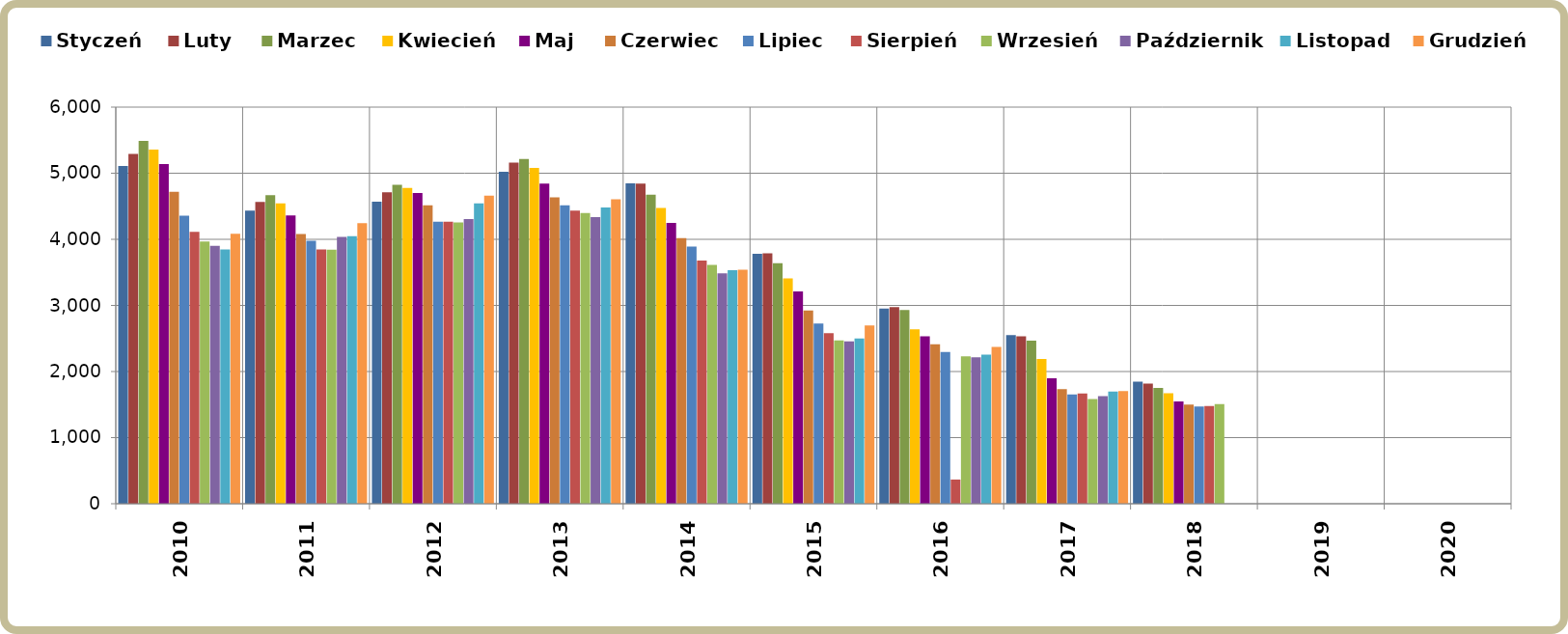
| Category | Styczeń | Luty | Marzec | Kwiecień | Maj | Czerwiec | Lipiec | Sierpień | Wrzesień | Październik | Listopad | Grudzień |
|---|---|---|---|---|---|---|---|---|---|---|---|---|
| 2010.0 | 5111 | 5292 | 5488 | 5357 | 5139 | 4718 | 4359 | 4112 | 3968 | 3900 | 3847 | 4083 |
| 2011.0 | 4434 | 4567 | 4668 | 4543 | 4363 | 4082 | 3977 | 3846 | 3842 | 4036 | 4047 | 4246 |
| 2012.0 | 4570 | 4712 | 4824 | 4776 | 4699 | 4514 | 4266 | 4267 | 4254 | 4305 | 4542 | 4662 |
| 2013.0 | 5021 | 5161 | 5215 | 5079 | 4844 | 4636 | 4516 | 4433 | 4399 | 4334 | 4482 | 4607 |
| 2014.0 | 4845 | 4843 | 4677 | 4473 | 4249 | 4020 | 3889 | 3680 | 3613 | 3487 | 3534 | 3541 |
| 2015.0 | 3781 | 3790 | 3638 | 3410 | 3210 | 2924 | 2726 | 2582 | 2470 | 2458 | 2499 | 2698 |
| 2016.0 | 2951 | 2976 | 2930 | 2639 | 2532 | 2412 | 2295 | 366 | 2229 | 2214 | 2255 | 2371 |
| 2017.0 | 2552 | 2534 | 2466 | 2190 | 1896 | 1732 | 1652 | 1669 | 1584 | 1629 | 1697 | 1703 |
| 2018.0 | 1845 | 1818 | 1751 | 1673 | 1549 | 1499 | 1469 | 1479 | 1507 | 0 | 0 | 0 |
| 2019.0 | 0 | 0 | 0 | 0 | 0 | 0 | 0 | 0 | 0 | 0 | 0 | 0 |
| 2020.0 | 0 | 0 | 0 | 0 | 0 | 0 | 0 | 0 | 0 | 0 | 0 | 0 |